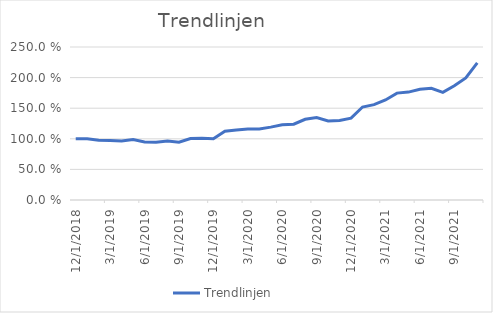
| Category | Trendlinjen |
|---|---|
| 12/1/18 | 1 |
| 1/1/19 | 1 |
| 2/1/19 | 0.978 |
| 3/1/19 | 0.971 |
| 4/1/19 | 0.965 |
| 5/1/19 | 0.987 |
| 6/1/19 | 0.949 |
| 7/1/19 | 0.944 |
| 8/1/19 | 0.962 |
| 9/1/19 | 0.946 |
| 10/1/19 | 1.005 |
| 11/1/19 | 1.008 |
| 12/1/19 | 0.999 |
| 1/1/20 | 1.125 |
| 2/1/20 | 1.143 |
| 3/1/20 | 1.16 |
| 4/1/20 | 1.16 |
| 5/1/20 | 1.191 |
| 6/1/20 | 1.229 |
| 7/1/20 | 1.238 |
| 8/1/20 | 1.319 |
| 9/1/20 | 1.347 |
| 10/1/20 | 1.293 |
| 11/1/20 | 1.3 |
| 12/1/20 | 1.337 |
| 1/1/21 | 1.519 |
| 2/1/21 | 1.558 |
| 3/1/21 | 1.635 |
| 4/1/21 | 1.746 |
| 5/1/21 | 1.763 |
| 6/1/21 | 1.81 |
| 7/1/21 | 1.826 |
| 8/1/21 | 1.758 |
| 9/1/21 | 1.865 |
| 10/1/21 | 1.993 |
| 11/1/21 | 2.241 |